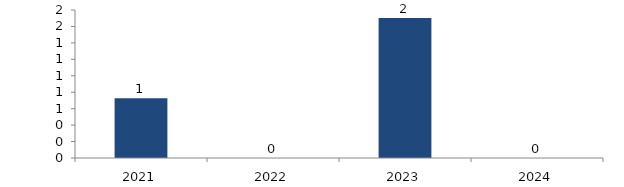
| Category | Bogotá |
|---|---|
| 2021.0 | 0.726 |
| 2022.0 | 0 |
| 2023.0 | 1.704 |
| 2024.0 | 0 |